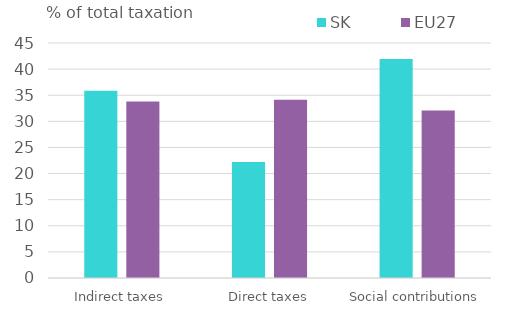
| Category | SK | EU27 |
|---|---|---|
| Indirect taxes | 35.835 | 33.811 |
| Direct taxes | 22.234 | 34.133 |
| Social contributions | 41.932 | 32.056 |